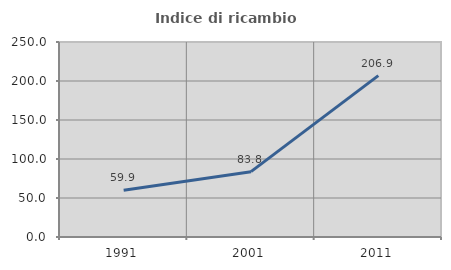
| Category | Indice di ricambio occupazionale  |
|---|---|
| 1991.0 | 59.864 |
| 2001.0 | 83.761 |
| 2011.0 | 206.897 |